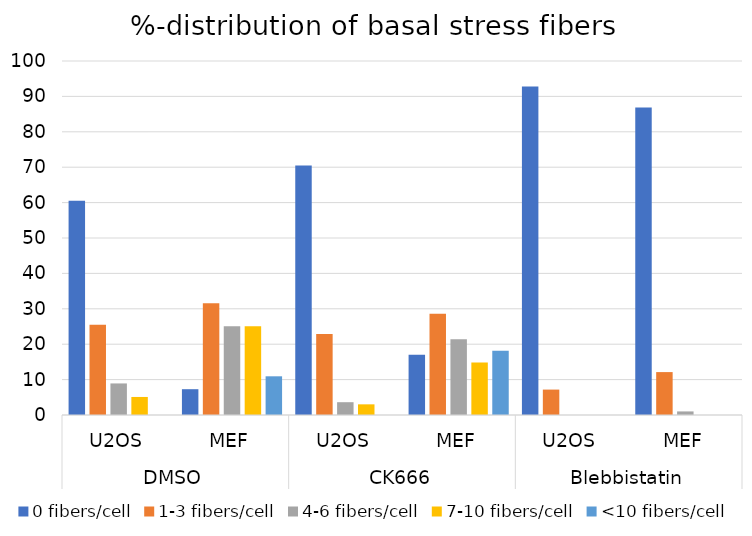
| Category | 0 fibers/cell | 1-3 fibers/cell | 4-6 fibers/cell | 7-10 fibers/cell | <10 fibers/cell |
|---|---|---|---|---|---|
| 0 | 60.51 | 25.478 | 8.917 | 5.096 | 0 |
| 1 | 7.287 | 31.579 | 25.101 | 25.101 | 10.931 |
| 2 | 70.482 | 22.892 | 3.614 | 3.012 | 0 |
| 3 | 17.033 | 28.571 | 21.429 | 14.835 | 18.132 |
| 4 | 92.821 | 7.179 | 0 | 0 | 0 |
| 5 | 86.869 | 12.121 | 1.01 | 0 | 0 |